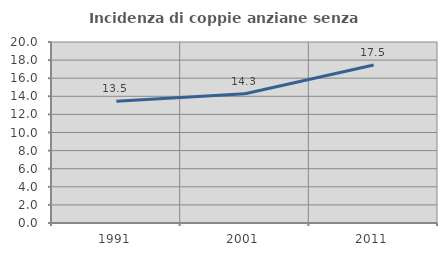
| Category | Incidenza di coppie anziane senza figli  |
|---|---|
| 1991.0 | 13.459 |
| 2001.0 | 14.286 |
| 2011.0 | 17.464 |